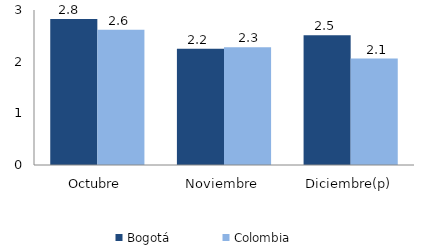
| Category | Bogotá | Colombia |
|---|---|---|
| Octubre | 2.824 | 2.618 |
| Noviembre | 2.25 | 2.277 |
| Diciembre(p) | 2.514 | 2.059 |